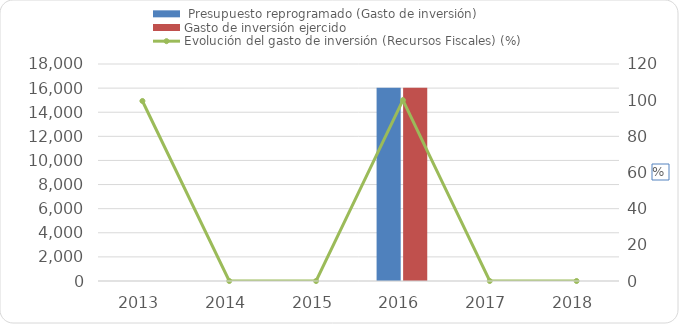
| Category |  Presupuesto reprogramado (Gasto de inversión) | Gasto de inversión ejercido |
|---|---|---|
| 2013 | 0 | 0 |
| 2014 | 0 | 0 |
| 2015 | 0 | 0 |
| 2016 | 16031.3 | 16031.3 |
| 2017 | 0 | 0 |
| 2018 | 0 | 0 |